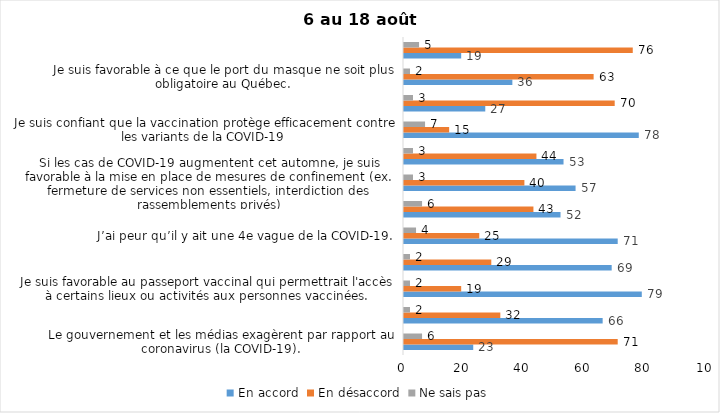
| Category | En accord | En désaccord | Ne sais pas |
|---|---|---|---|
| Le gouvernement et les médias exagèrent par rapport au coronavirus (la COVID-19). | 23 | 71 | 6 |
| J’ai peur que le système de santé soit débordé par les cas de COVID-19 suite au "déconfinement" | 66 | 32 | 2 |
| Je suis favorable au passeport vaccinal qui permettrait l'accès à certains lieux ou activités aux personnes vaccinées. | 79 | 19 | 2 |
| Malgré la levée des mesures de confinement, je préfère limiter mes contacts avec d’autres personnes (par ex., en évitant les activités sociales et de groupes) | 69 | 29 | 2 |
| J’ai peur qu’il y ait une 4e vague de la COVID-19. | 71 | 25 | 4 |
| Dans les régions en zone verte, le risque d’attraper la COVID-19 est minime. | 52 | 43 | 6 |
| Si les cas de COVID-19 augmentent cet automne, je suis favorable à la mise en place de mesures de confinement (ex. fermeture de services non essentiels, interdiction des rassemblements privés) | 57 | 40 | 3 |
| Je suis inquiet de contracter le variant Delta de la Covid-19 | 53 | 44 | 3 |
| Je suis confiant que la vaccination protège efficacement contre les variants de la COVID-19 | 78 | 15 | 7 |
| En raison de la baisse des cas de COID-19 je pense que le gouvernement du Québec devrait mettre fin à l’état d’urgence sanitaire | 27 | 70 | 3 |
| Je suis favorable à ce que le port du masque ne soit plus obligatoire au Québec. | 36 | 63 | 2 |
| Étant donné la progression de la vaccination, je pense qu’il est moins important de suivre les mesures de prévention. | 19 | 76 | 5 |